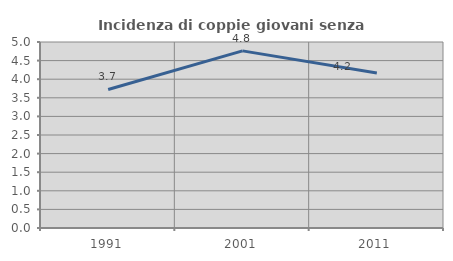
| Category | Incidenza di coppie giovani senza figli |
|---|---|
| 1991.0 | 3.723 |
| 2001.0 | 4.762 |
| 2011.0 | 4.167 |